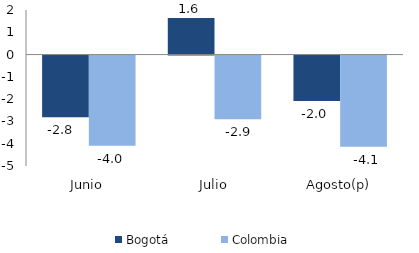
| Category | Bogotá | Colombia |
|---|---|---|
| Junio | -2.762 | -4.049 |
| Julio | 1.641 | -2.855 |
| Agosto(p) | -2.039 | -4.087 |